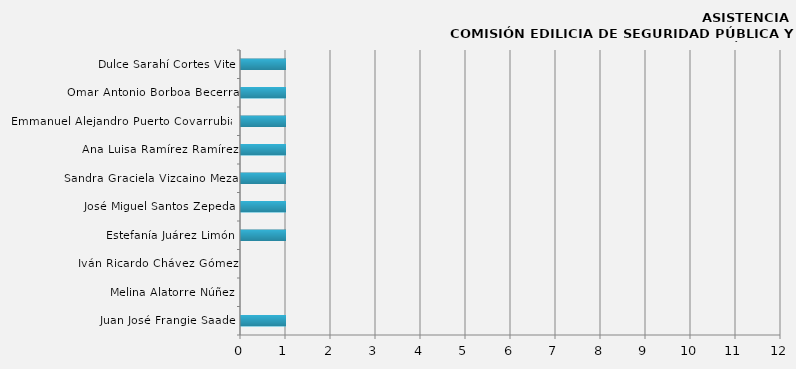
| Category | Series 0 |
|---|---|
| Juan José Frangie Saade | 1 |
| Melina Alatorre Núñez | 0 |
| Iván Ricardo Chávez Gómez | 0 |
| Estefanía Juárez Limón | 1 |
| José Miguel Santos Zepeda | 1 |
| Sandra Graciela Vizcaino Meza | 1 |
| Ana Luisa Ramírez Ramírez | 1 |
| Emmanuel Alejandro Puerto Covarrubias | 1 |
| Omar Antonio Borboa Becerra | 1 |
| Dulce Sarahí Cortes Vite | 1 |